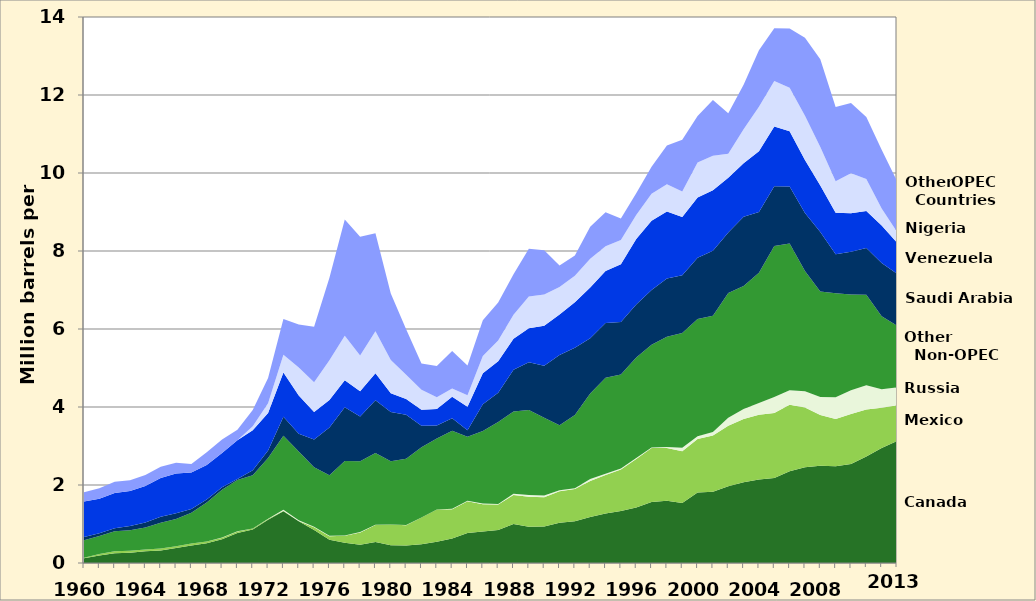
| Category | Canada | Mexico | Russia | Other Non-OPEC | Saudi Arabia | Venezuela | Nigeria | Other OPEC Countries |
|---|---|---|---|---|---|---|---|---|
| 1960.0 | 0.12 | 0.016 | 0 | 0.445 | 0.084 | 0.911 | 0 | 0.238 |
| 1961.0 | 0.19 | 0.04 | 0 | 0.463 | 0.073 | 0.879 | 0 | 0.272 |
| 1962.0 | 0.25 | 0.049 | 0 | 0.517 | 0.074 | 0.906 | 0 | 0.286 |
| 1963.0 | 0.265 | 0.048 | 0 | 0.527 | 0.108 | 0.9 | 0 | 0.274 |
| 1964.0 | 0.299 | 0.047 | 0 | 0.561 | 0.131 | 0.933 | 0 | 0.287 |
| 1965.0 | 0.323 | 0.048 | 0 | 0.658 | 0.158 | 0.994 | 0 | 0.286 |
| 1966.0 | 0.384 | 0.045 | 0 | 0.7 | 0.147 | 1.018 | 0 | 0.279 |
| 1967.0 | 0.45 | 0.049 | 0 | 0.791 | 0.092 | 0.938 | 0 | 0.218 |
| 1968.0 | 0.506 | 0.045 | 0 | 1.001 | 0.074 | 0.886 | 0 | 0.326 |
| 1969.0 | 0.608 | 0.043 | 0.002 | 1.227 | 0.065 | 0.875 | 0 | 0.346 |
| 1970.0 | 0.766 | 0.042 | 0.003 | 1.314 | 0.03 | 0.989 | 0 | 0.275 |
| 1971.0 | 0.857 | 0.027 | 0 | 1.368 | 0.128 | 1.02 | 0.102 | 0.422 |
| 1972.0 | 1.108 | 0.021 | 0.008 | 1.557 | 0.19 | 0.959 | 0.251 | 0.646 |
| 1973.0 | 1.325 | 0.016 | 0.026 | 1.897 | 0.486 | 1.135 | 0.459 | 0.913 |
| 1974.0 | 1.07 | 0.008 | 0.02 | 1.758 | 0.461 | 0.979 | 0.713 | 1.103 |
| 1975.0 | 0.846 | 0.071 | 0.014 | 1.522 | 0.715 | 0.702 | 0.762 | 1.422 |
| 1976.0 | 0.599 | 0.087 | 0.011 | 1.55 | 1.23 | 0.7 | 1.025 | 2.111 |
| 1977.0 | 0.517 | 0.179 | 0.012 | 1.906 | 1.38 | 0.69 | 1.143 | 2.979 |
| 1978.0 | 0.467 | 0.318 | 0.008 | 1.819 | 1.144 | 0.646 | 0.919 | 3.043 |
| 1979.0 | 0.538 | 0.439 | 0.001 | 1.841 | 1.356 | 0.69 | 1.08 | 2.511 |
| 1980.0 | 0.455 | 0.533 | 0.001 | 1.621 | 1.261 | 0.481 | 0.857 | 1.701 |
| 1981.0 | 0.447 | 0.522 | 0.005 | 1.698 | 1.129 | 0.406 | 0.62 | 1.168 |
| 1982.0 | 0.482 | 0.685 | 0.001 | 1.8 | 0.552 | 0.412 | 0.514 | 0.668 |
| 1983.0 | 0.547 | 0.826 | 0.001 | 1.814 | 0.337 | 0.422 | 0.302 | 0.801 |
| 1984.0 | 0.63 | 0.748 | 0.013 | 1.997 | 0.325 | 0.548 | 0.216 | 0.96 |
| 1985.0 | 0.77 | 0.816 | 0.008 | 1.643 | 0.168 | 0.605 | 0.293 | 0.765 |
| 1986.0 | 0.807 | 0.699 | 0.018 | 1.863 | 0.685 | 0.793 | 0.44 | 0.918 |
| 1987.0 | 0.848 | 0.655 | 0.011 | 2.104 | 0.751 | 0.804 | 0.535 | 0.97 |
| 1988.0 | 0.999 | 0.747 | 0.029 | 2.107 | 1.073 | 0.794 | 0.618 | 1.034 |
| 1989.0 | 0.931 | 0.767 | 0.048 | 2.175 | 1.224 | 0.873 | 0.815 | 1.228 |
| 1990.0 | 0.934 | 0.755 | 0.045 | 1.988 | 1.339 | 1.025 | 0.8 | 1.132 |
| 1991.0 | 1.033 | 0.807 | 0.029 | 1.666 | 1.802 | 1.035 | 0.703 | 0.553 |
| 1992.0 | 1.069 | 0.83 | 0.018 | 1.879 | 1.72 | 1.17 | 0.681 | 0.521 |
| 1993.0 | 1.181 | 0.919 | 0.055 | 2.192 | 1.414 | 1.3 | 0.74 | 0.82 |
| 1994.0 | 1.272 | 0.984 | 0.03 | 2.463 | 1.402 | 1.334 | 0.637 | 0.873 |
| 1995.0 | 1.332 | 1.068 | 0.025 | 2.409 | 1.344 | 1.48 | 0.627 | 0.55 |
| 1996.0 | 1.424 | 1.244 | 0.025 | 2.574 | 1.363 | 1.676 | 0.617 | 0.555 |
| 1997.0 | 1.563 | 1.385 | 0.013 | 2.632 | 1.407 | 1.773 | 0.698 | 0.691 |
| 1998.0 | 1.598 | 1.351 | 0.024 | 2.829 | 1.491 | 1.719 | 0.696 | 0.999 |
| 1999.0 | 1.539 | 1.324 | 0.089 | 2.946 | 1.478 | 1.493 | 0.657 | 1.325 |
| 2000.0 | 1.807 | 1.373 | 0.072 | 3.005 | 1.572 | 1.546 | 0.896 | 1.188 |
| 2001.0 | 1.828 | 1.44 | 0.09 | 2.985 | 1.662 | 1.553 | 0.885 | 1.428 |
| 2002.0 | 1.971 | 1.547 | 0.21 | 3.198 | 1.552 | 1.398 | 0.621 | 1.034 |
| 2003.0 | 2.072 | 1.623 | 0.254 | 3.153 | 1.774 | 1.376 | 0.867 | 1.144 |
| 2004.0 | 2.138 | 1.665 | 0.298 | 3.343 | 1.558 | 1.554 | 1.14 | 1.449 |
| 2005.0 | 2.181 | 1.662 | 0.41 | 3.873 | 1.537 | 1.529 | 1.166 | 1.356 |
| 2006.0 | 2.353 | 1.705 | 0.369 | 3.763 | 1.463 | 1.419 | 1.114 | 1.52 |
| 2007.0 | 2.455 | 1.532 | 0.414 | 3.088 | 1.485 | 1.361 | 1.134 | 2 |
| 2008.0 | 2.493 | 1.302 | 0.465 | 2.702 | 1.529 | 1.189 | 0.988 | 2.248 |
| 2009.0 | 2.479 | 1.21 | 0.563 | 2.663 | 1.004 | 1.063 | 0.809 | 1.9 |
| 2010.0 | 2.535 | 1.284 | 0.612 | 2.455 | 1.096 | 0.988 | 1.023 | 1.8 |
| 2011.0 | 2.729 | 1.206 | 0.624 | 2.322 | 1.195 | 0.951 | 0.818 | 1.592 |
| 2012.0 | 2.946 | 1.035 | 0.477 | 1.868 | 1.365 | 0.96 | 0.441 | 1.505 |
| 2013.0 | 3.125 | 0.919 | 0.459 | 1.585 | 1.328 | 0.797 | 0.281 | 1.3 |